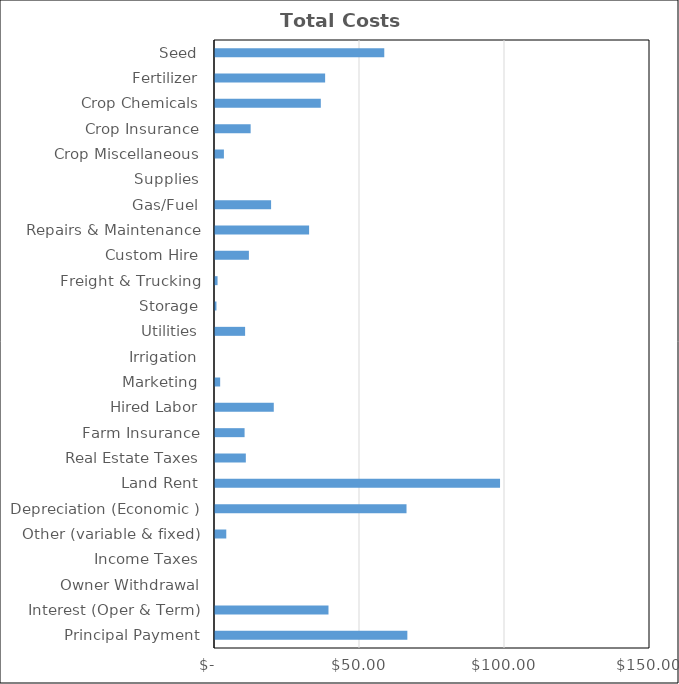
| Category | Soybeans |
|---|---|
| Seed | 58.37 |
| Fertilizer | 37.975 |
| Crop Chemicals | 36.486 |
| Crop Insurance | 12.29 |
| Crop Miscellaneous | 3.07 |
| Supplies | 0 |
| Gas/Fuel | 19.34 |
| Repairs & Maintenance | 32.45 |
| Custom Hire | 11.69 |
| Freight & Trucking | 0.88 |
| Storage | 0.5 |
| Utilities | 10.38 |
| Irrigation | 0 |
| Marketing | 1.78 |
| Hired Labor | 20.27 |
| Farm Insurance | 10.2 |
| Real Estate Taxes | 10.63 |
| Land Rent | 98.29 |
| Depreciation (Economic ) | 66.04 |
| Other (variable & fixed) | 3.89 |
| Income Taxes | 0 |
| Owner Withdrawal | 0 |
| Interest (Oper & Term) | 39.133 |
| Principal Payment | 66.328 |